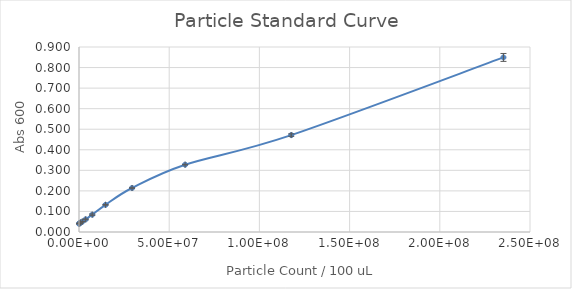
| Category | Series 0 |
|---|---|
| 235294117.64705887 | 0.849 |
| 117647058.82352944 | 0.472 |
| 58823529.41176472 | 0.328 |
| 29411764.70588236 | 0.214 |
| 14705882.35294118 | 0.132 |
| 7352941.17647059 | 0.084 |
| 3676470.588235295 | 0.062 |
| 1838235.2941176475 | 0.05 |
| 919117.6470588237 | 0.046 |
| 459558.82352941186 | 0.043 |
| 229779.41176470593 | 0.042 |
| 0.0 | 0.04 |